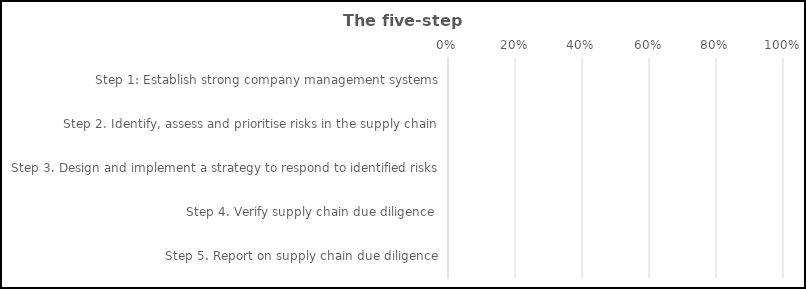
| Category | Red | Yellow | Green |
|---|---|---|---|
| Step 1: Establish strong company management systems | 0 | 0 | 0 |
| Step 2. Identify, assess and prioritise risks in the supply chain | 0 | 0 | 0 |
| Step 3. Design and implement a strategy to respond to identified risks | 0 | 0 | 0 |
| Step 4. Verify supply chain due diligence  | 0 | 0 | 0 |
| Step 5. Report on supply chain due diligence | 0 | 0 | 0 |